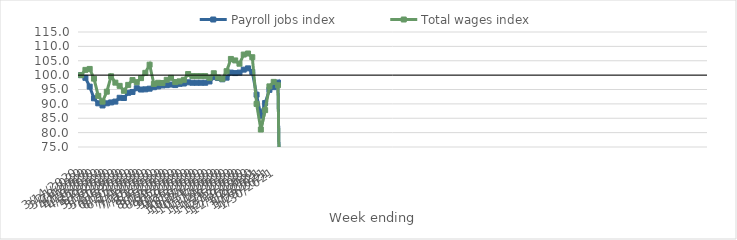
| Category | Payroll jobs index | Total wages index |
|---|---|---|
| 14/03/2020 | 100 | 100 |
| 21/03/2020 | 99.065 | 101.826 |
| 28/03/2020 | 95.99 | 102.155 |
| 04/04/2020 | 91.937 | 98.777 |
| 11/04/2020 | 90.19 | 92.797 |
| 18/04/2020 | 89.45 | 90.784 |
| 25/04/2020 | 90.197 | 94.244 |
| 02/05/2020 | 90.501 | 99.593 |
| 09/05/2020 | 90.8 | 97.384 |
| 16/05/2020 | 92.119 | 96.263 |
| 23/05/2020 | 92.038 | 94.546 |
| 30/05/2020 | 93.848 | 96.605 |
| 06/06/2020 | 94.144 | 98.29 |
| 13/06/2020 | 95.448 | 97.544 |
| 20/06/2020 | 94.988 | 98.955 |
| 27/06/2020 | 95.058 | 100.793 |
| 04/07/2020 | 95.288 | 103.622 |
| 11/07/2020 | 95.799 | 96.93 |
| 18/07/2020 | 96.078 | 97.335 |
| 25/07/2020 | 96.414 | 97.263 |
| 01/08/2020 | 96.507 | 98.363 |
| 08/08/2020 | 96.719 | 99.054 |
| 15/08/2020 | 96.538 | 97.577 |
| 22/08/2020 | 96.967 | 97.835 |
| 29/08/2020 | 97.08 | 98.367 |
| 05/09/2020 | 97.5 | 100.377 |
| 12/09/2020 | 97.347 | 99.657 |
| 19/09/2020 | 97.347 | 99.657 |
| 26/09/2020 | 97.347 | 99.657 |
| 03/10/2020 | 97.347 | 99.657 |
| 10/10/2020 | 97.794 | 99.083 |
| 17/10/2020 | 99.303 | 100.654 |
| 24/10/2020 | 98.988 | 99.187 |
| 31/10/2020 | 98.549 | 98.743 |
| 07/11/2020 | 99.116 | 101.373 |
| 14/11/2020 | 100.89 | 105.629 |
| 21/11/2020 | 100.707 | 105.11 |
| 28/11/2020 | 100.888 | 103.964 |
| 05/12/2020 | 101.909 | 107.154 |
| 12/12/2020 | 102.353 | 107.518 |
| 19/12/2020 | 101.112 | 106.226 |
| 26/12/2020 | 93.194 | 89.986 |
| 02/01/2021 | 85.844 | 81.073 |
| 09/01/2021 | 90.283 | 87.826 |
| 16/01/2021 | 94.875 | 96.086 |
| 23/01/2021 | 95.818 | 97.649 |
| 30/01/2021 | 97.411 | 96.482 |